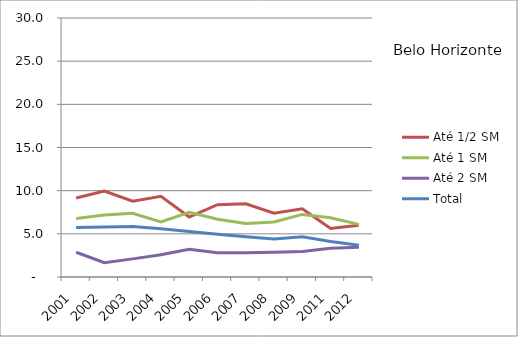
| Category | Até 1/2 SM | Até 1 SM | Até 2 SM | Total |
|---|---|---|---|---|
| 2001.0 | 9.15 | 6.77 | 2.87 | 5.72 |
| 2002.0 | 9.96 | 7.18 | 1.66 | 5.78 |
| 2003.0 | 8.78 | 7.39 | 2.1 | 5.86 |
| 2004.0 | 9.34 | 6.39 | 2.57 | 5.59 |
| 2005.0 | 6.94 | 7.5 | 3.22 | 5.26 |
| 2006.0 | 8.37 | 6.68 | 2.8 | 4.96 |
| 2007.0 | 8.48 | 6.2 | 2.81 | 4.67 |
| 2008.0 | 7.4 | 6.37 | 2.87 | 4.41 |
| 2009.0 | 7.9 | 7.25 | 2.96 | 4.66 |
| 2011.0 | 5.62 | 6.87 | 3.33 | 4.12 |
| 2012.0 | 6 | 6.1 | 3.46 | 3.69 |